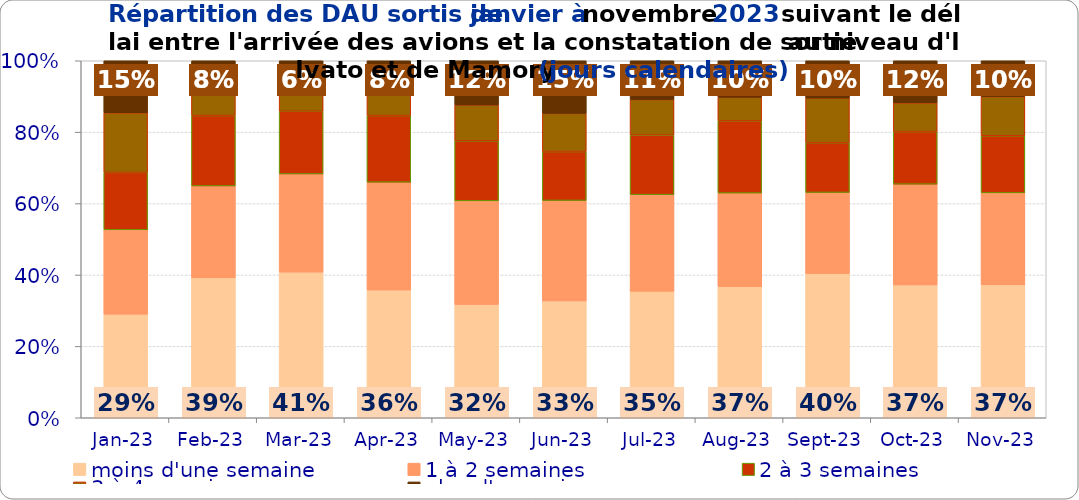
| Category | moins d'une semaine | 1 à 2 semaines | 2 à 3 semaines | 3 à 4 semaines | plus d'un mois |
|---|---|---|---|---|---|
| 2023-01-01 | 0.29 | 0.236 | 0.161 | 0.167 | 0.146 |
| 2023-02-01 | 0.392 | 0.258 | 0.197 | 0.077 | 0.076 |
| 2023-03-01 | 0.408 | 0.275 | 0.176 | 0.079 | 0.062 |
| 2023-04-01 | 0.358 | 0.302 | 0.187 | 0.078 | 0.076 |
| 2023-05-01 | 0.317 | 0.29 | 0.168 | 0.101 | 0.124 |
| 2023-06-01 | 0.327 | 0.281 | 0.137 | 0.107 | 0.147 |
| 2023-07-01 | 0.354 | 0.27 | 0.167 | 0.099 | 0.109 |
| 2023-08-01 | 0.367 | 0.262 | 0.202 | 0.066 | 0.102 |
| 2023-09-01 | 0.404 | 0.227 | 0.14 | 0.125 | 0.105 |
| 2023-10-01 | 0.372 | 0.282 | 0.147 | 0.081 | 0.118 |
| 2023-11-01 | 0.372 | 0.258 | 0.16 | 0.11 | 0.1 |